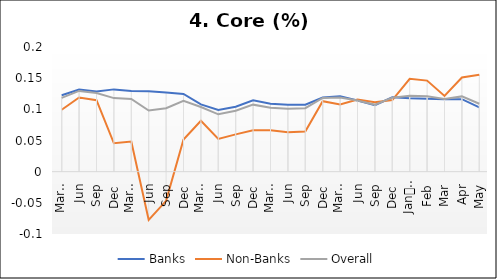
| Category | Banks | Non-Banks | Overall |
|---|---|---|---|
| 0 | 0.123 | 0.099 | 0.118 |
| 1 | 0.132 | 0.119 | 0.13 |
| 2 | 0.128 | 0.115 | 0.126 |
| 3 | 0.132 | 0.046 | 0.118 |
| 4 | 0.13 | 0.048 | 0.117 |
| 5 | 0.129 | -0.077 | 0.098 |
| 6 | 0.127 | -0.047 | 0.102 |
| 7 | 0.125 | 0.052 | 0.114 |
| 8 | 0.108 | 0.082 | 0.104 |
| 9 | 0.099 | 0.053 | 0.092 |
| 10 | 0.104 | 0.06 | 0.098 |
| 11 | 0.114 | 0.066 | 0.108 |
| 12 | 0.109 | 0.066 | 0.102 |
| 13 | 0.107 | 0.063 | 0.101 |
| 14 | 0.108 | 0.064 | 0.102 |
| 15 | 0.119 | 0.113 | 0.118 |
| 16 | 0.121 | 0.108 | 0.119 |
| 17 | 0.114 | 0.116 | 0.114 |
| 18 | 0.107 | 0.111 | 0.107 |
| 19 | 0.119 | 0.115 | 0.119 |
| 20 | 0.118 | 0.149 | 0.122 |
| 21 | 0.117 | 0.146 | 0.121 |
| 22 | 0.116 | 0.122 | 0.117 |
| 23 | 0.116 | 0.151 | 0.121 |
| 24 | 0.103 | 0.156 | 0.109 |